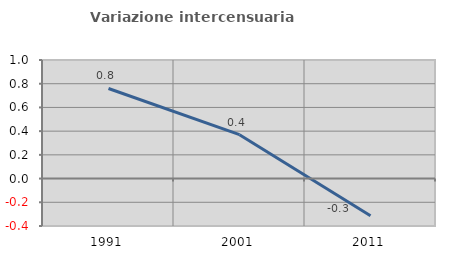
| Category | Variazione intercensuaria annua |
|---|---|
| 1991.0 | 0.76 |
| 2001.0 | 0.37 |
| 2011.0 | -0.314 |